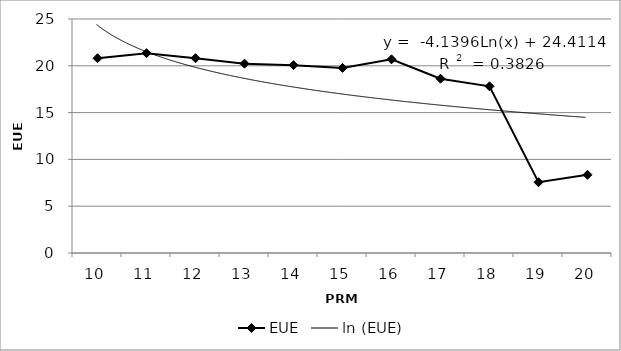
| Category | EUE |
|---|---|
| 10.0 | 20.807 |
| 11.0 | 21.348 |
| 12.0 | 20.81 |
| 13.0 | 20.227 |
| 14.0 | 20.069 |
| 15.0 | 19.773 |
| 16.0 | 20.692 |
| 17.0 | 18.619 |
| 18.0 | 17.811 |
| 19.0 | 7.561 |
| 20.0 | 8.357 |